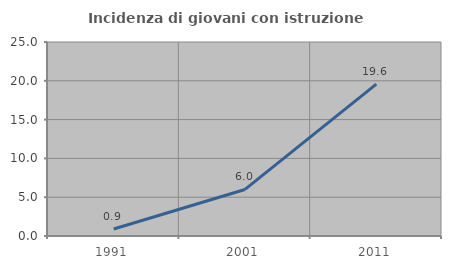
| Category | Incidenza di giovani con istruzione universitaria |
|---|---|
| 1991.0 | 0.901 |
| 2001.0 | 6 |
| 2011.0 | 19.565 |